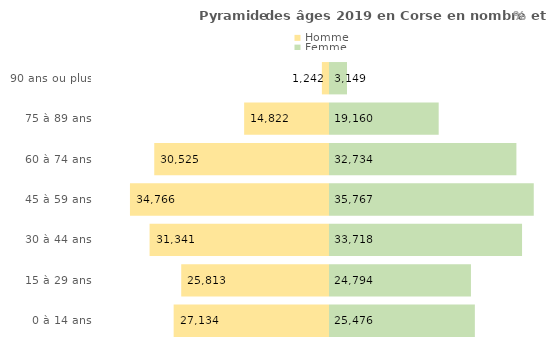
| Category | Homme | Femme |
|---|---|---|
| 0 à 14 ans | -27134 | 25476 |
| 15 à 29 ans | -25813 | 24794 |
| 30 à 44 ans | -31341 | 33718 |
| 45 à 59 ans | -34766 | 35767 |
| 60 à 74 ans | -30525 | 32734 |
| 75 à 89 ans | -14822 | 19160 |
| 90 ans ou plus | -1242 | 3149 |